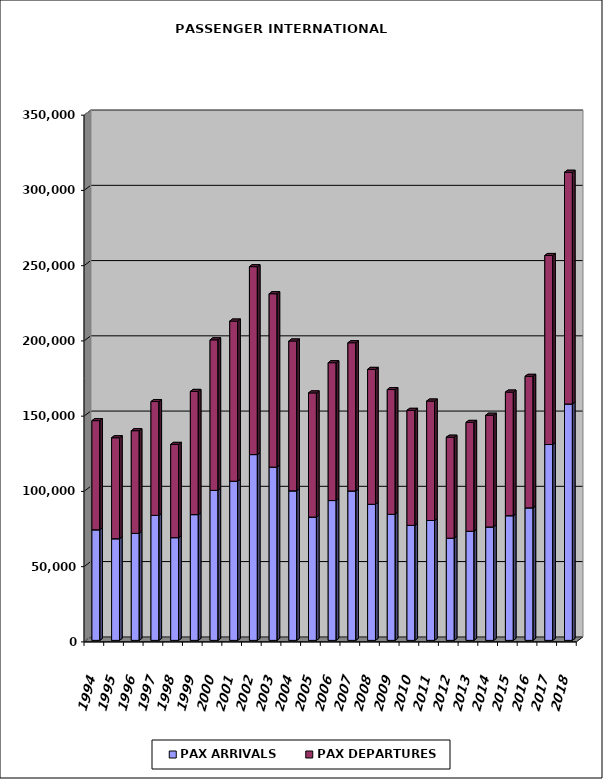
| Category | PAX ARRIVALS | PAX DEPARTURES |
|---|---|---|
| 1994.0 | 73485 | 72526 |
| 1995.0 | 67552 | 67089 |
| 1996.0 | 71107 | 68228 |
| 1997.0 | 83060 | 75649 |
| 1998.0 | 68270 | 61963 |
| 1999.0 | 83575 | 81859 |
| 2000.0 | 99675 | 100038 |
| 2001.0 | 105771 | 106409 |
| 2002.0 | 123473 | 124858 |
| 2003.0 | 115122 | 115218 |
| 2004.0 | 99375 | 99558 |
| 2005.0 | 81938 | 82502 |
| 2006.0 | 92926 | 91584 |
| 2007.0 | 99285 | 98484 |
| 2008.0 | 90436 | 89632 |
| 2009.0 | 83767 | 82907 |
| 2010.0 | 76429 | 76432 |
| 2011.0 | 79651 | 79385 |
| 2012.0 | 67933 | 67080 |
| 2013.0 | 72512 | 72343 |
| 2014.0 | 75370 | 74255 |
| 2015.0 | 82857 | 82143 |
| 2016.0 | 88068 | 87396 |
| 2017.0 | 130140 | 125621 |
| 2018.0 | 157091 | 153964 |